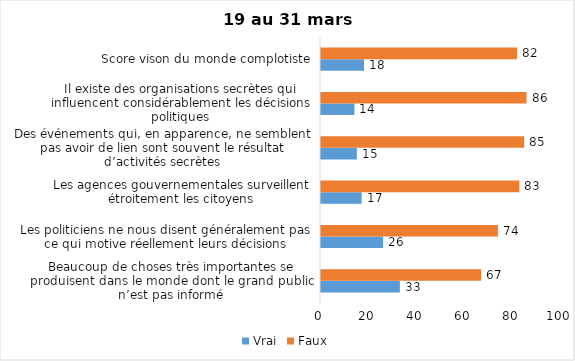
| Category | Vrai | Faux |
|---|---|---|
| Beaucoup de choses très importantes se produisent dans le monde dont le grand public n’est pas informé | 33 | 67 |
| Les politiciens ne nous disent généralement pas ce qui motive réellement leurs décisions | 26 | 74 |
| Les agences gouvernementales surveillent étroitement les citoyens | 17 | 83 |
| Des événements qui, en apparence, ne semblent pas avoir de lien sont souvent le résultat d’activités secrètes | 15 | 85 |
| Il existe des organisations secrètes qui influencent considérablement les décisions politiques | 14 | 86 |
| Score vison du monde complotiste | 18 | 82 |